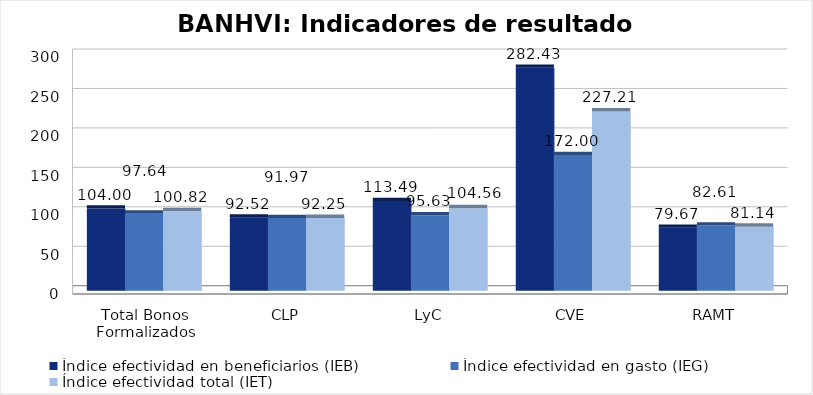
| Category | Índice efectividad en beneficiarios (IEB) | Índice efectividad en gasto (IEG)  | Índice efectividad total (IET) |
|---|---|---|---|
| Total Bonos Formalizados | 103.999 | 97.641 | 100.82 |
| CLP | 92.523 | 91.969 | 92.246 |
| LyC | 113.49 | 95.628 | 104.559 |
| CVE | 282.427 | 171.999 | 227.213 |
| RAMT | 79.668 | 82.61 | 81.139 |